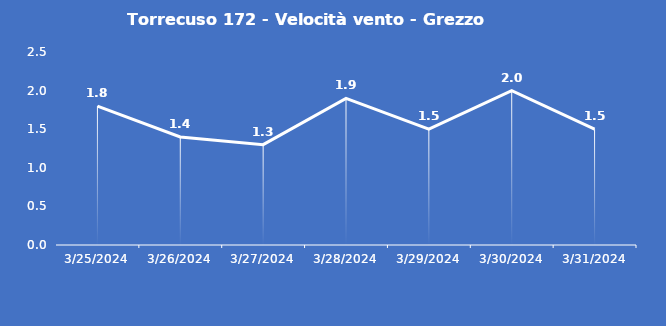
| Category | Torrecuso 172 - Velocità vento - Grezzo (m/s) |
|---|---|
| 3/25/24 | 1.8 |
| 3/26/24 | 1.4 |
| 3/27/24 | 1.3 |
| 3/28/24 | 1.9 |
| 3/29/24 | 1.5 |
| 3/30/24 | 2 |
| 3/31/24 | 1.5 |